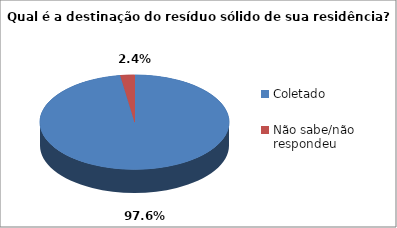
| Category | Series 0 |
|---|---|
| Coletado | 121 |
| Não sabe/não respondeu | 3 |